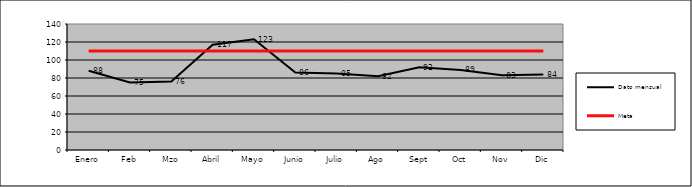
| Category | Dato mensual | Meta |
|---|---|---|
| Enero | 88 | 110 |
| Feb | 75 | 110 |
| Mzo | 76 | 110 |
| Abril | 117 | 110 |
| Mayo | 123 | 110 |
| Junio | 86 | 110 |
| Julio | 85 | 110 |
| Ago | 82 | 110 |
| Sept | 92 | 110 |
| Oct | 89 | 110 |
| Nov | 83 | 110 |
| Dic | 84 | 110 |